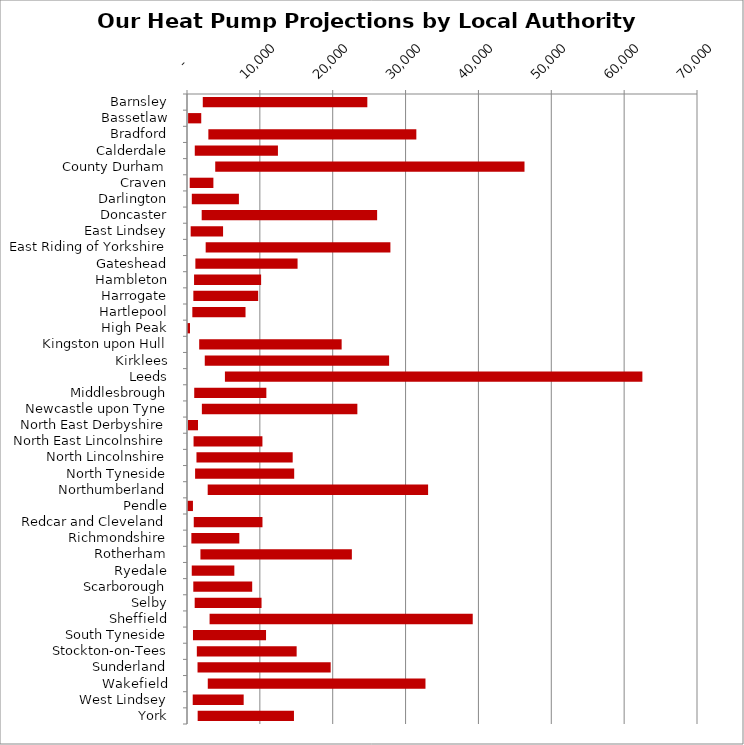
| Category | MIN | MAX |
|---|---|---|
| Barnsley | 2166 | 22585 |
| Bassetlaw | 151 | 1804 |
| Bradford | 2932 | 28546 |
| Calderdale | 1068 | 11413 |
| County Durham | 3875 | 42448 |
| Craven | 372 | 3250 |
| Darlington | 661 | 6463 |
| Doncaster | 2016 | 24080 |
| East Lindsey | 505 | 4446 |
| East Riding of Yorkshire | 2563 | 25354 |
| Gateshead | 1149 | 14027 |
| Hambleton | 969 | 9204 |
| Harrogate | 871 | 8897 |
| Hartlepool | 732 | 7300 |
| High Peak | 41 | 373 |
| Kingston upon Hull | 1673 | 19553 |
| Kirklees | 2439 | 25302 |
| Leeds | 5205 | 57299 |
| Middlesbrough | 992 | 9899 |
| Newcastle upon Tyne | 2041 | 21341 |
| North East Derbyshire | 140 | 1368 |
| North East Lincolnshire | 901 | 9452 |
| North Lincolnshire | 1300 | 13207 |
| North Tyneside | 1111 | 13602 |
| Northumberland | 2841 | 30251 |
| Pendle | 73 | 743 |
| Redcar and Cleveland | 928 | 9430 |
| Richmondshire | 599 | 6582 |
| Rotherham | 1844 | 20784 |
| Ryedale | 653 | 5844 |
| Scarborough | 864 | 8084 |
| Selby | 1055 | 9176 |
| Sheffield | 3100 | 36118 |
| South Tyneside | 820 | 10029 |
| Stockton-on-Tees | 1349 | 13701 |
| Sunderland | 1445 | 18275 |
| Wakefield | 2852 | 29880 |
| West Lindsey | 786 | 6993 |
| York | 1464 | 13217 |